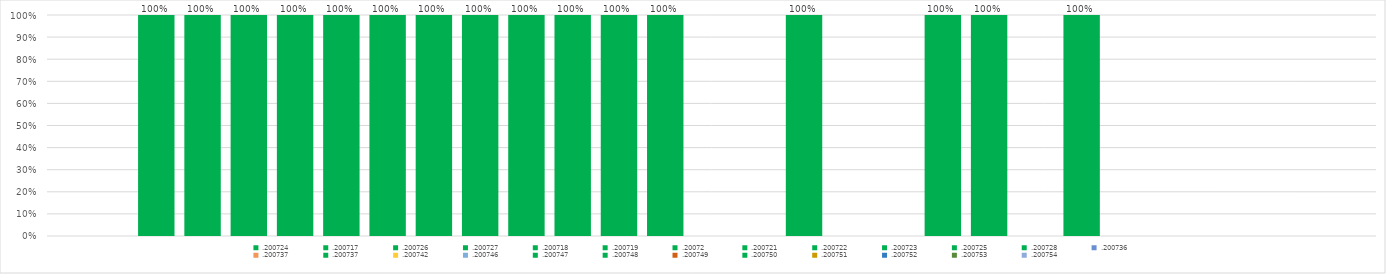
| Category | .200724 | .200717 | .200726 | .200727 | .200718 | .200719 | .20072 | .200721 | .200722 | .200723 | .200725 | .200728 | .200736 | .200737 | .200742 | .200746 | .200747 | .200748 | .200749 | .200750 | .200751 | .200752 | .200753 | .200754 |
|---|---|---|---|---|---|---|---|---|---|---|---|---|---|---|---|---|---|---|---|---|---|---|---|---|
| 0 | 1 | 1 | 1 | 1 | 1 | 1 | 1 | 1 | 1 | 1 | 1 | 1 | 0 | 1 | 0 | 0 | 1 | 1 | 0 | 1 | 0 | 0 | 0 | 0 |